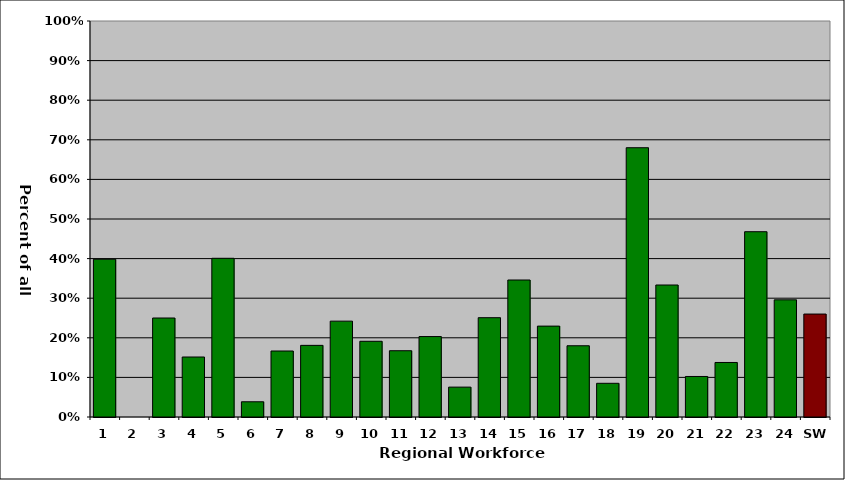
| Category | Series 0 |
|---|---|
| 1 | 0.398 |
| 2 | 0 |
| 3 | 0.25 |
| 4 | 0.152 |
| 5 | 0.401 |
| 6 | 0.038 |
| 7 | 0.167 |
| 8 | 0.181 |
| 9 | 0.242 |
| 10 | 0.191 |
| 11 | 0.167 |
| 12 | 0.203 |
| 13 | 0.075 |
| 14 | 0.251 |
| 15 | 0.346 |
| 16 | 0.23 |
| 17 | 0.18 |
| 18 | 0.085 |
| 19 | 0.68 |
| 20 | 0.333 |
| 21 | 0.102 |
| 22 | 0.138 |
| 23 | 0.468 |
| 24 | 0.296 |
| SW | 0.26 |